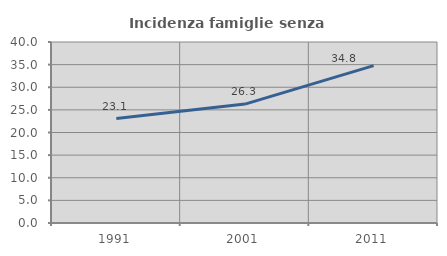
| Category | Incidenza famiglie senza nuclei |
|---|---|
| 1991.0 | 23.092 |
| 2001.0 | 26.281 |
| 2011.0 | 34.772 |